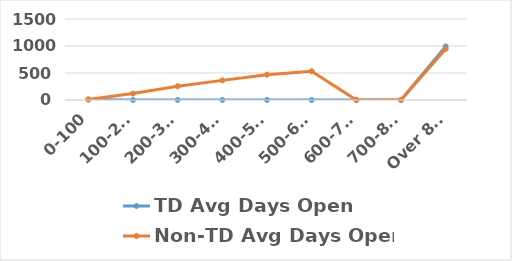
| Category | TD Avg Days Open  | Non-TD Avg Days Open  |
|---|---|---|
| 0-100 | 10.197 | 8.156 |
| 100-200 | 0 | 119.429 |
| 200-300 | 0 | 254.8 |
| 300-400 | 0 | 363.641 |
| 400-500 | 0 | 468.884 |
| 500-600 | 0 | 532.486 |
| 600-700 | 0 | 0 |
| 700-800 | 0 | 0 |
| Over 800 | 992.758 | 944.211 |